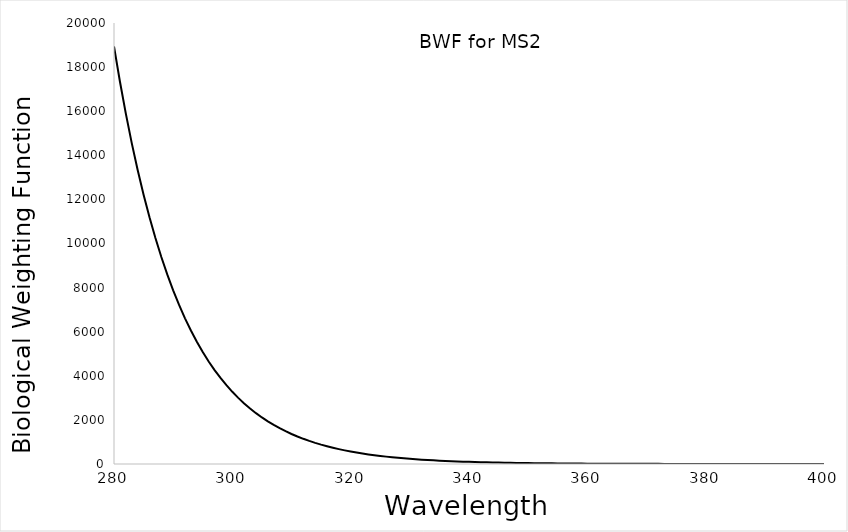
| Category | BWF |
|---|---|
| 280.0 | 18937.347 |
| 281.0 | 17346.403 |
| 282.0 | 15889.116 |
| 283.0 | 14554.257 |
| 284.0 | 13331.541 |
| 285.0 | 12211.546 |
| 286.0 | 11185.643 |
| 287.0 | 10245.927 |
| 288.0 | 9385.158 |
| 289.0 | 8596.702 |
| 290.0 | 7874.486 |
| 291.0 | 7212.943 |
| 292.0 | 6606.977 |
| 293.0 | 6051.919 |
| 294.0 | 5543.492 |
| 295.0 | 5077.778 |
| 296.0 | 4651.19 |
| 297.0 | 4260.439 |
| 298.0 | 3902.516 |
| 299.0 | 3574.662 |
| 300.0 | 3274.351 |
| 301.0 | 2999.27 |
| 302.0 | 2747.299 |
| 303.0 | 2516.496 |
| 304.0 | 2305.083 |
| 305.0 | 2111.431 |
| 306.0 | 1934.047 |
| 307.0 | 1771.566 |
| 308.0 | 1622.735 |
| 309.0 | 1486.408 |
| 310.0 | 1361.534 |
| 311.0 | 1247.15 |
| 312.0 | 1142.376 |
| 313.0 | 1046.404 |
| 314.0 | 958.494 |
| 315.0 | 877.97 |
| 316.0 | 804.211 |
| 317.0 | 736.649 |
| 318.0 | 674.762 |
| 319.0 | 618.075 |
| 320.0 | 566.15 |
| 321.0 | 518.587 |
| 322.0 | 475.02 |
| 323.0 | 435.113 |
| 324.0 | 398.559 |
| 325.0 | 365.076 |
| 326.0 | 334.405 |
| 327.0 | 306.312 |
| 328.0 | 280.578 |
| 329.0 | 257.007 |
| 330.0 | 235.415 |
| 331.0 | 215.638 |
| 332.0 | 197.522 |
| 333.0 | 180.928 |
| 334.0 | 165.728 |
| 335.0 | 151.805 |
| 336.0 | 139.052 |
| 337.0 | 127.37 |
| 338.0 | 116.669 |
| 339.0 | 106.868 |
| 340.0 | 97.89 |
| 341.0 | 89.666 |
| 342.0 | 82.133 |
| 343.0 | 75.233 |
| 344.0 | 68.913 |
| 345.0 | 63.123 |
| 346.0 | 57.82 |
| 347.0 | 52.963 |
| 348.0 | 48.513 |
| 349.0 | 44.438 |
| 350.0 | 40.704 |
| 351.0 | 37.285 |
| 352.0 | 34.152 |
| 353.0 | 31.283 |
| 354.0 | 28.655 |
| 355.0 | 26.248 |
| 356.0 | 24.043 |
| 357.0 | 22.023 |
| 358.0 | 20.173 |
| 359.0 | 18.478 |
| 360.0 | 16.926 |
| 361.0 | 15.504 |
| 362.0 | 14.201 |
| 363.0 | 13.008 |
| 364.0 | 11.915 |
| 365.0 | 10.914 |
| 366.0 | 9.997 |
| 367.0 | 9.157 |
| 368.0 | 8.388 |
| 369.0 | 7.683 |
| 370.0 | 7.038 |
| 371.0 | 6.447 |
| 372.0 | 5.905 |
| 373.0 | 5.409 |
| 374.0 | 4.955 |
| 375.0 | 4.538 |
| 376.0 | 4.157 |
| 377.0 | 3.808 |
| 378.0 | 3.488 |
| 379.0 | 3.195 |
| 380.0 | 2.927 |
| 381.0 | 2.681 |
| 382.0 | 2.455 |
| 383.0 | 2.249 |
| 384.0 | 2.06 |
| 385.0 | 1.887 |
| 386.0 | 1.729 |
| 387.0 | 1.583 |
| 388.0 | 1.45 |
| 389.0 | 1.329 |
| 390.0 | 1.217 |
| 391.0 | 1.115 |
| 392.0 | 1.021 |
| 393.0 | 0.935 |
| 394.0 | 0.857 |
| 395.0 | 0.785 |
| 396.0 | 0.719 |
| 397.0 | 0.658 |
| 398.0 | 0.603 |
| 399.0 | 0.552 |
| 400.0 | 0.506 |
| 401.0 | 0.463 |
| 402.0 | 0.425 |
| 403.0 | 0.389 |
| 404.0 | 0.356 |
| 405.0 | 0.326 |
| 406.0 | 0.299 |
| 407.0 | 0.274 |
| 408.0 | 0.251 |
| 409.0 | 0.23 |
| 410.0 | 0.21 |
| 411.0 | 0.193 |
| 412.0 | 0.177 |
| 413.0 | 0.162 |
| 414.0 | 0.148 |
| 415.0 | 0.136 |
| 416.0 | 0.124 |
| 417.0 | 0.114 |
| 418.0 | 0.104 |
| 419.0 | 0.096 |
| 420.0 | 0.087 |
| 421.0 | 0.08 |
| 422.0 | 0.073 |
| 423.0 | 0.067 |
| 424.0 | 0.062 |
| 425.0 | 0.056 |
| 426.0 | 0.052 |
| 427.0 | 0.047 |
| 428.0 | 0.043 |
| 429.0 | 0.04 |
| 430.0 | 0.036 |
| 431.0 | 0.033 |
| 432.0 | 0.031 |
| 433.0 | 0.028 |
| 434.0 | 0.026 |
| 435.0 | 0.023 |
| 436.0 | 0.021 |
| 437.0 | 0.02 |
| 438.0 | 0.018 |
| 439.0 | 0.017 |
| 440.0 | 0.015 |
| 441.0 | 0.014 |
| 442.0 | 0.013 |
| 443.0 | 0.012 |
| 444.0 | 0.011 |
| 445.0 | 0.01 |
| 446.0 | 0.009 |
| 447.0 | 0.008 |
| 448.0 | 0.007 |
| 449.0 | 0.007 |
| 450.0 | 0.006 |
| 451.0 | 0.006 |
| 452.0 | 0.005 |
| 453.0 | 0.005 |
| 454.0 | 0.004 |
| 455.0 | 0.004 |
| 456.0 | 0.004 |
| 457.0 | 0.003 |
| 458.0 | 0.003 |
| 459.0 | 0.003 |
| 460.0 | 0.003 |
| 461.0 | 0.002 |
| 462.0 | 0.002 |
| 463.0 | 0.002 |
| 464.0 | 0.002 |
| 465.0 | 0.002 |
| 466.0 | 0.002 |
| 467.0 | 0.001 |
| 468.0 | 0.001 |
| 469.0 | 0.001 |
| 470.0 | 0.001 |
| 471.0 | 0.001 |
| 472.0 | 0.001 |
| 473.0 | 0.001 |
| 474.0 | 0.001 |
| 475.0 | 0.001 |
| 476.0 | 0.001 |
| 477.0 | 0.001 |
| 478.0 | 0.001 |
| 479.0 | 0 |
| 480.0 | 0 |
| 481.0 | 0 |
| 482.0 | 0 |
| 483.0 | 0 |
| 484.0 | 0 |
| 485.0 | 0 |
| 486.0 | 0 |
| 487.0 | 0 |
| 488.0 | 0 |
| 489.0 | 0 |
| 490.0 | 0 |
| 491.0 | 0 |
| 492.0 | 0 |
| 493.0 | 0 |
| 494.0 | 0 |
| 495.0 | 0 |
| 496.0 | 0 |
| 497.0 | 0 |
| 498.0 | 0 |
| 499.0 | 0 |
| 500.0 | 0 |